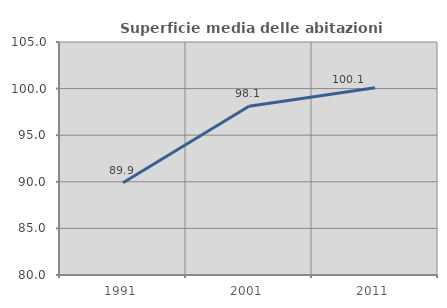
| Category | Superficie media delle abitazioni occupate |
|---|---|
| 1991.0 | 89.899 |
| 2001.0 | 98.104 |
| 2011.0 | 100.095 |